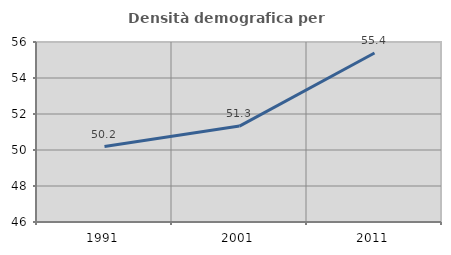
| Category | Densità demografica |
|---|---|
| 1991.0 | 50.189 |
| 2001.0 | 51.329 |
| 2011.0 | 55.391 |